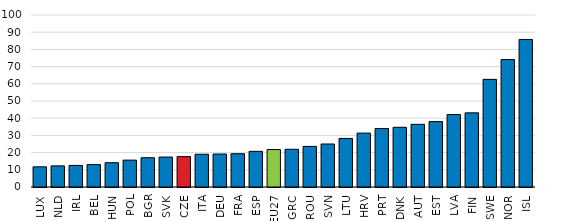
| Category | Series 1 |
|---|---|
| LUX | 11.735 |
| NLD | 12.28 |
| IRL | 12.546 |
| BEL | 13.014 |
| HUN | 14.115 |
| POL | 15.624 |
| BGR | 17.015 |
| SVK | 17.412 |
| CZE | 17.667 |
| ITA | 19.034 |
| DEU | 19.168 |
| FRA | 19.342 |
| ESP | 20.729 |
| EU27 | 21.775 |
| GRC | 21.928 |
| ROU | 23.596 |
| SVN | 25 |
| LTU | 28.23 |
| HRV | 31.329 |
| PRT | 33.982 |
| DNK | 34.718 |
| AUT | 36.445 |
| EST | 38.01 |
| LVA | 42.107 |
| FIN | 43.096 |
| SWE | 62.573 |
| NOR | 74.086 |
| ISL | 85.785 |